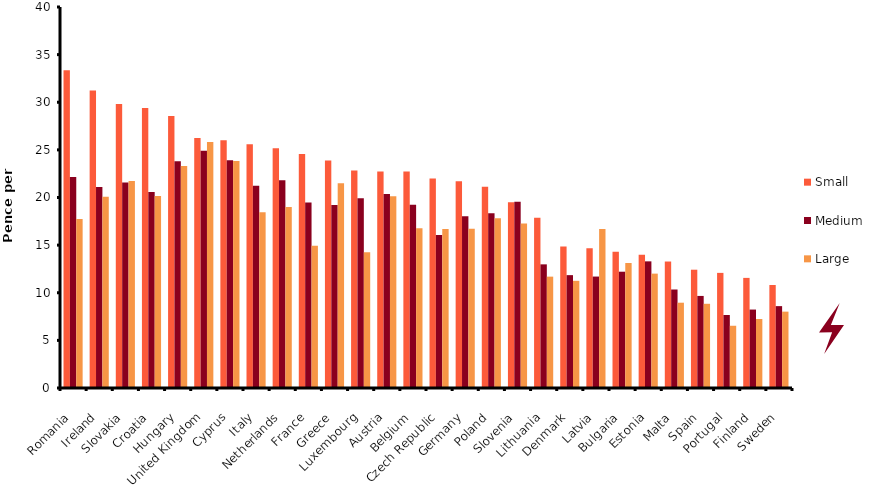
| Category | Small | Medium | Large |
|---|---|---|---|
| Romania | 33.347 | 22.147 | 17.735 |
| Ireland | 31.233 | 21.094 | 20.085 |
| Slovakia | 29.821 | 21.576 | 21.726 |
| Croatia | 29.409 | 20.585 | 20.156 |
| Hungary | 28.549 | 23.795 | 23.295 |
| United Kingdom | 26.245 | 24.914 | 25.824 |
| Cyprus | 26.006 | 23.901 | 23.831 |
| Italy | 25.585 | 21.226 | 18.445 |
| Netherlands | 25.164 | 21.813 | 19.015 |
| France | 24.567 | 19.48 | 14.937 |
| Greece | 23.892 | 19.217 | 21.489 |
| Luxembourg | 22.839 | 19.927 | 14.261 |
| Austria | 22.734 | 20.375 | 20.12 |
| Belgium | 22.725 | 19.235 | 16.779 |
| Czech Republic | 21.997 | 16.068 | 16.682 |
| Germany | 21.717 | 18.024 | 16.709 |
| Poland | 21.129 | 18.349 | 17.814 |
| Slovenia | 19.498 | 19.542 | 17.261 |
| Lithuania | 17.866 | 12.981 | 11.692 |
| Denmark | 14.849 | 11.849 | 11.253 |
| Latvia | 14.665 | 11.7 | 16.7 |
| Bulgaria | 14.297 | 12.209 | 13.121 |
| Estonia | 13.99 | 13.297 | 12.007 |
| Malta | 13.279 | 10.341 | 8.955 |
| Spain | 12.42 | 9.666 | 8.841 |
| Portugal | 12.086 | 7.666 | 6.534 |
| Finland | 11.56 | 8.236 | 7.245 |
| Sweden | 10.815 | 8.595 | 8.017 |